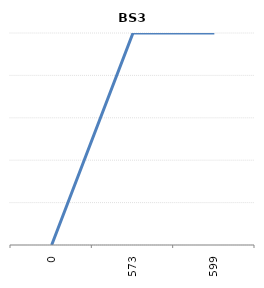
| Category | BS3 |
|---|---|
| 0.0 | 0 |
| 573.0 | 1 |
| 599.0 | 1 |